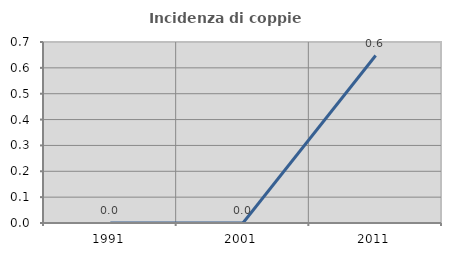
| Category | Incidenza di coppie miste |
|---|---|
| 1991.0 | 0 |
| 2001.0 | 0 |
| 2011.0 | 0.648 |